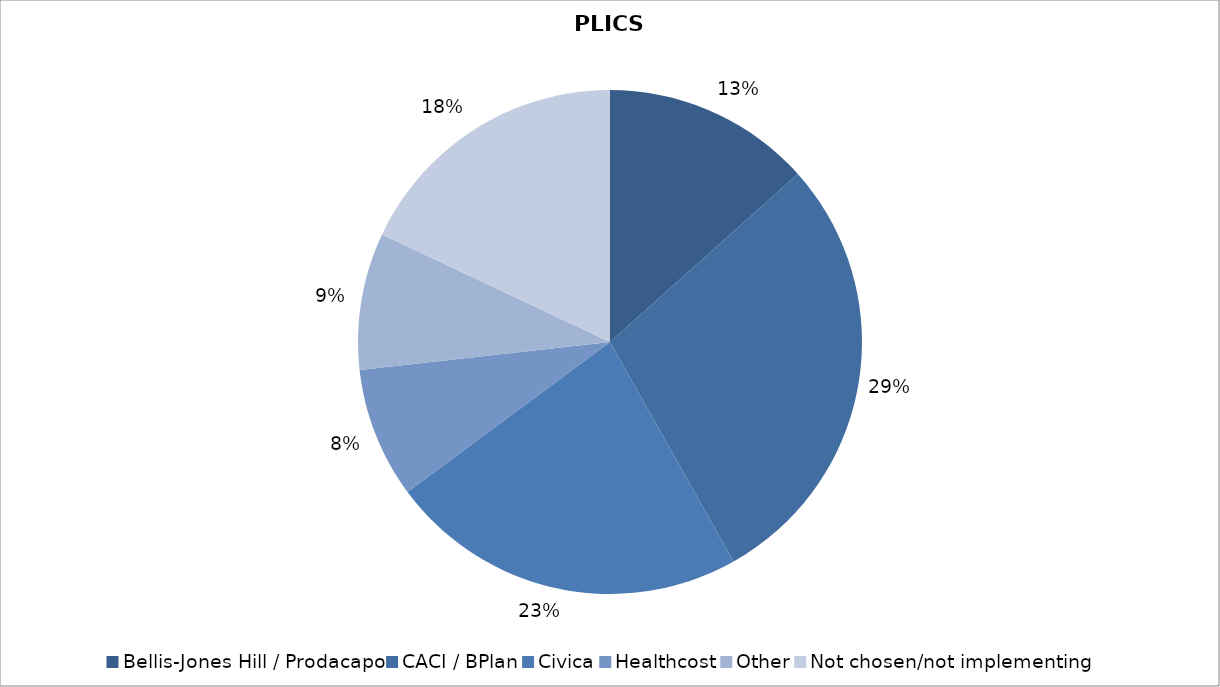
| Category | Series 0 |
|---|---|
| Bellis-Jones Hill / Prodacapo | 32 |
| CACI / BPlan | 68 |
| Civica | 55 |
| Healthcost | 20 |
| Other | 21 |
| Not chosen/not implementing | 43 |